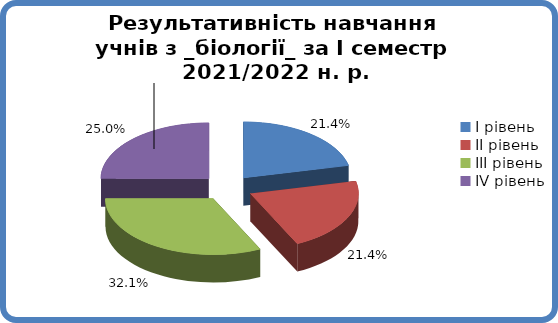
| Category | Series 0 |
|---|---|
| 0 | 0.214 |
| 1 | 0.214 |
| 2 | 0.321 |
| 3 | 0.25 |